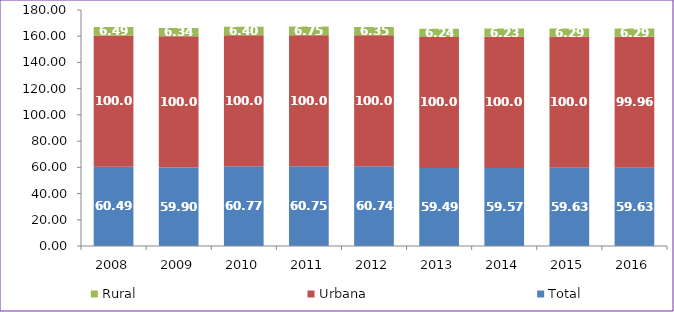
| Category | Total | Urbana | Rural |
|---|---|---|---|
| 2008.0 | 60.49 | 100 | 6.49 |
| 2009.0 | 59.9 | 100 | 6.34 |
| 2010.0 | 60.77 | 100 | 6.4 |
| 2011.0 | 60.75 | 100 | 6.75 |
| 2012.0 | 60.74 | 100 | 6.35 |
| 2013.0 | 59.49 | 100 | 6.24 |
| 2014.0 | 59.57 | 100 | 6.23 |
| 2015.0 | 59.63 | 100 | 6.29 |
| 2016.0 | 59.63 | 99.96 | 6.29 |